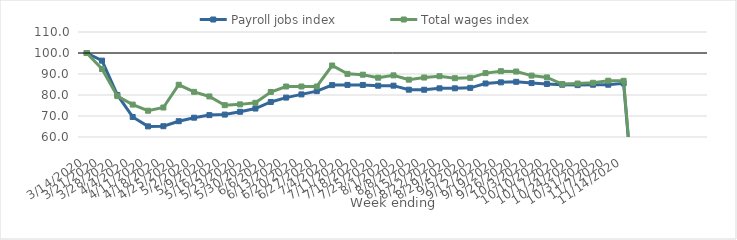
| Category | Payroll jobs index | Total wages index |
|---|---|---|
| 14/03/2020 | 100 | 100 |
| 21/03/2020 | 96.362 | 92.382 |
| 28/03/2020 | 80.019 | 79.475 |
| 04/04/2020 | 69.551 | 75.435 |
| 11/04/2020 | 65.058 | 72.521 |
| 18/04/2020 | 65.137 | 74.038 |
| 25/04/2020 | 67.518 | 84.874 |
| 02/05/2020 | 69.194 | 81.498 |
| 09/05/2020 | 70.427 | 79.315 |
| 16/05/2020 | 70.674 | 75.153 |
| 23/05/2020 | 72.006 | 75.539 |
| 30/05/2020 | 73.551 | 76.285 |
| 06/06/2020 | 76.674 | 81.432 |
| 13/06/2020 | 78.767 | 84.045 |
| 20/06/2020 | 80.287 | 84.046 |
| 27/06/2020 | 81.835 | 84.045 |
| 04/07/2020 | 84.715 | 94.041 |
| 11/07/2020 | 84.807 | 90.061 |
| 18/07/2020 | 84.772 | 89.671 |
| 25/07/2020 | 84.42 | 88.232 |
| 01/08/2020 | 84.447 | 89.348 |
| 08/08/2020 | 82.528 | 87.3 |
| 15/08/2020 | 82.505 | 88.314 |
| 22/08/2020 | 83.172 | 88.954 |
| 29/08/2020 | 83.182 | 88 |
| 05/09/2020 | 83.396 | 88.174 |
| 12/09/2020 | 85.485 | 90.418 |
| 19/09/2020 | 86.026 | 91.332 |
| 26/09/2020 | 86.284 | 91.169 |
| 03/10/2020 | 85.671 | 89.246 |
| 10/10/2020 | 85.255 | 88.37 |
| 17/10/2020 | 84.891 | 85.218 |
| 24/10/2020 | 84.709 | 85.469 |
| 31/10/2020 | 84.892 | 85.807 |
| 07/11/2020 | 84.889 | 86.812 |
| 14/11/2020 | 85.557 | 86.752 |